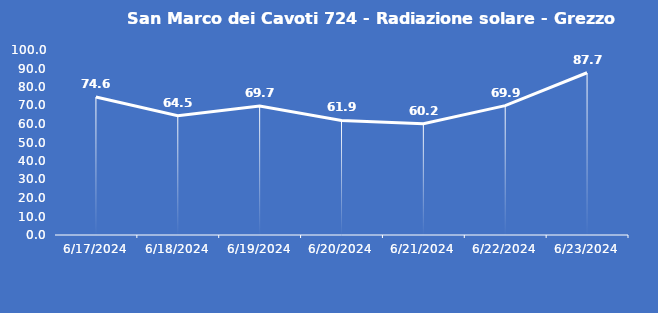
| Category | San Marco dei Cavoti 724 - Radiazione solare - Grezzo (W/m2) |
|---|---|
| 6/17/24 | 74.6 |
| 6/18/24 | 64.5 |
| 6/19/24 | 69.7 |
| 6/20/24 | 61.9 |
| 6/21/24 | 60.2 |
| 6/22/24 | 69.9 |
| 6/23/24 | 87.7 |